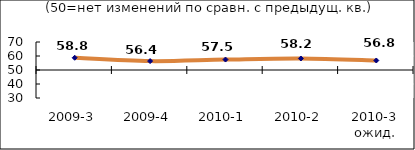
| Category | Диф.индекс ↓ |
|---|---|
| 2009-3 | 58.75 |
| 2009-4 | 56.36 |
| 2010-1 | 57.475 |
| 2010-2 | 58.215 |
| 2010-3 ожид. | 56.79 |